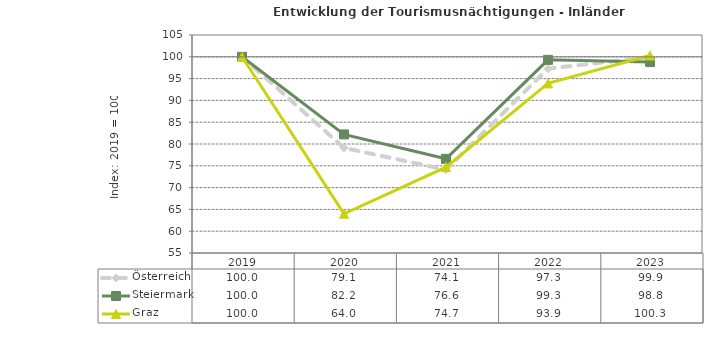
| Category | Österreich | Steiermark | Graz |
|---|---|---|---|
| 2023.0 | 99.9 | 98.8 | 100.3 |
| 2022.0 | 97.3 | 99.3 | 93.9 |
| 2021.0 | 74.1 | 76.6 | 74.7 |
| 2020.0 | 79.1 | 82.2 | 64 |
| 2019.0 | 100 | 100 | 100 |